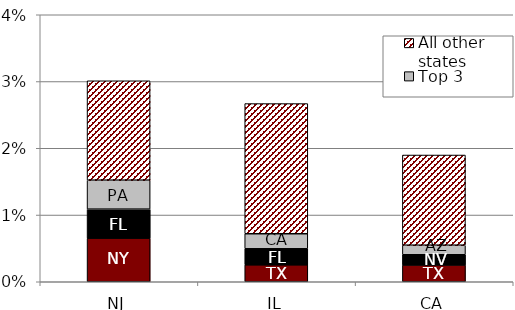
| Category | Top 1 | Top 2 | Top 3 | All other states |
|---|---|---|---|---|
| NJ | 0.007 | 0.004 | 0.004 | 0.015 |
| IL | 0.003 | 0.002 | 0.002 | 0.02 |
| CA | 0.003 | 0.002 | 0.001 | 0.014 |